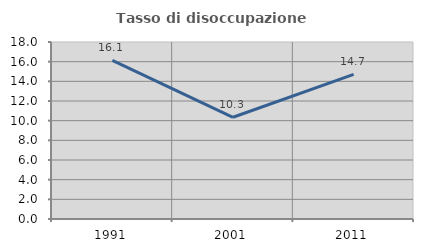
| Category | Tasso di disoccupazione giovanile  |
|---|---|
| 1991.0 | 16.129 |
| 2001.0 | 10.345 |
| 2011.0 | 14.706 |